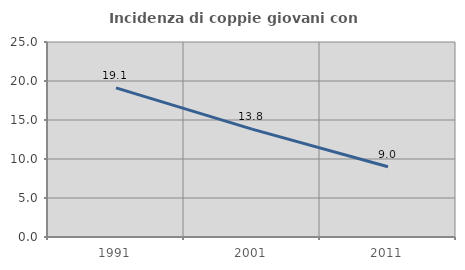
| Category | Incidenza di coppie giovani con figli |
|---|---|
| 1991.0 | 19.115 |
| 2001.0 | 13.828 |
| 2011.0 | 9 |